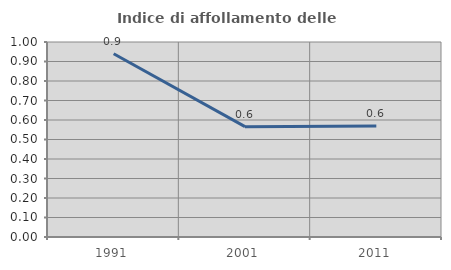
| Category | Indice di affollamento delle abitazioni  |
|---|---|
| 1991.0 | 0.94 |
| 2001.0 | 0.566 |
| 2011.0 | 0.569 |